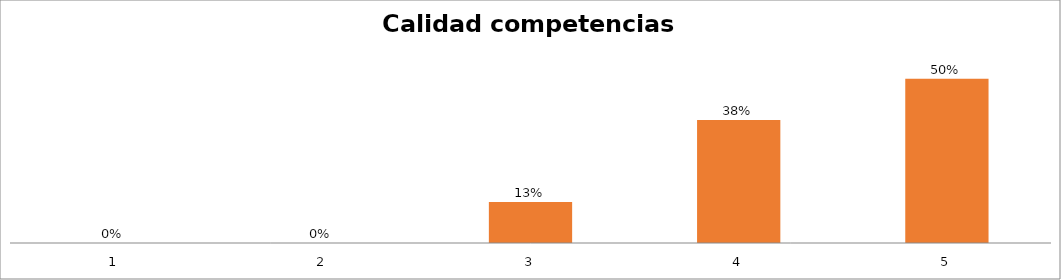
| Category | Series 1 |
|---|---|
| 0 | 0 |
| 1 | 0 |
| 2 | 0.125 |
| 3 | 0.375 |
| 4 | 0.5 |